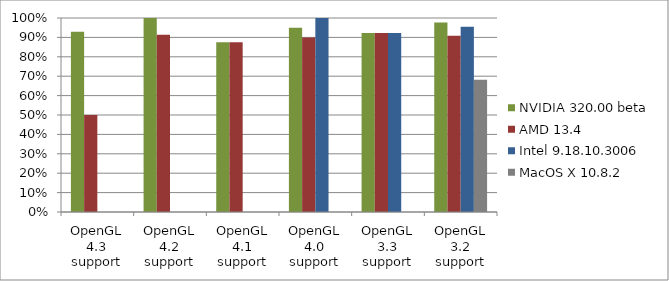
| Category | NVIDIA 320.00 beta | AMD 13.4 | Intel 9.18.10.3006 | MacOS X 10.8.2 |
|---|---|---|---|---|
| OpenGL 4.3 support | 0.929 | 0.5 | 0 | 0 |
| OpenGL 4.2 support | 1 | 0.913 | 0 | 0 |
| OpenGL 4.1 support | 0.875 | 0.875 | 0 | 0 |
| OpenGL 4.0 support | 0.95 | 0.9 | 1 | 0 |
| OpenGL 3.3 support | 0.923 | 0.923 | 0.923 | 0 |
| OpenGL 3.2 support | 0.977 | 0.909 | 0.955 | 0.682 |